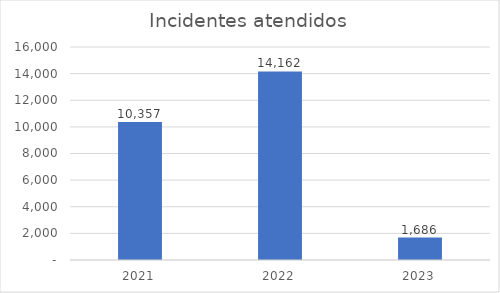
| Category | Series 0 |
|---|---|
| 2021.0 | 10357 |
| 2022.0 | 14162 |
| 2023.0 | 1686 |